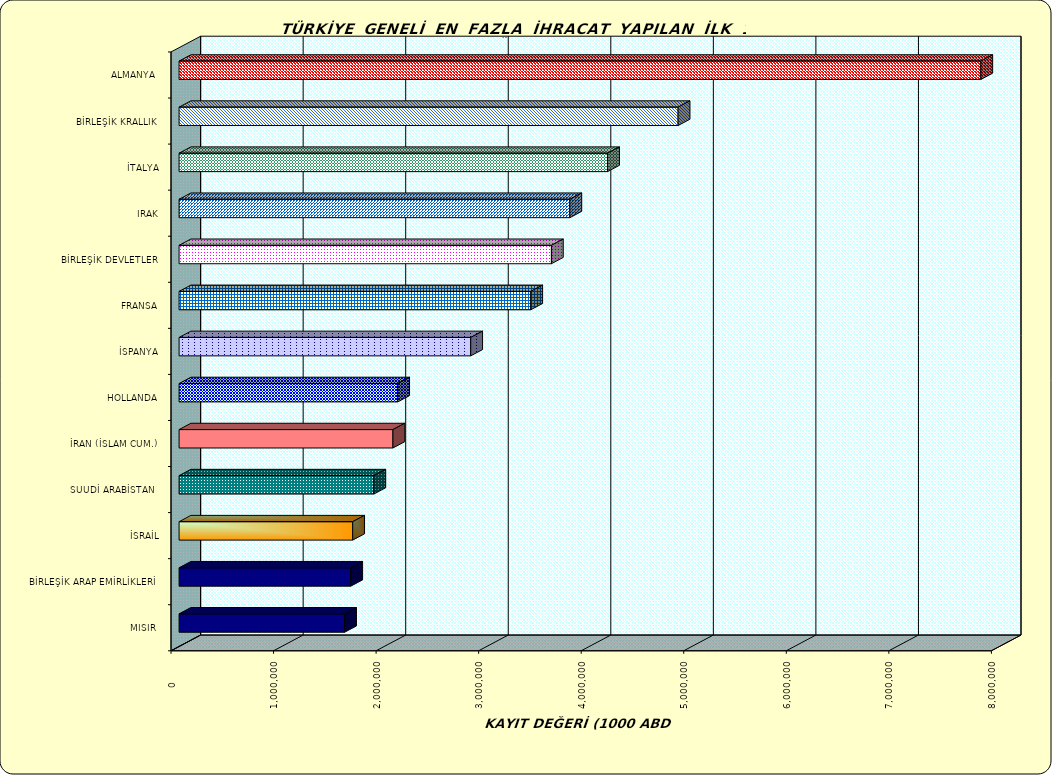
| Category | Series 0 |
|---|---|
| ALMANYA  | 7818113.636 |
| BİRLEŞİK KRALLIK | 4866411.095 |
| İTALYA | 4178530.073 |
| IRAK | 3810724.206 |
| BİRLEŞİK DEVLETLER | 3630798.027 |
| FRANSA | 3429353.405 |
| İSPANYA | 2843922.463 |
| HOLLANDA | 2131821.856 |
| İRAN (İSLAM CUM.) | 2085437.824 |
| SUUDİ ARABİSTAN  | 1899120.863 |
| İSRAİL | 1692899.468 |
| BİRLEŞİK ARAP EMİRLİKLERİ | 1674069.585 |
| MISIR  | 1614172.765 |